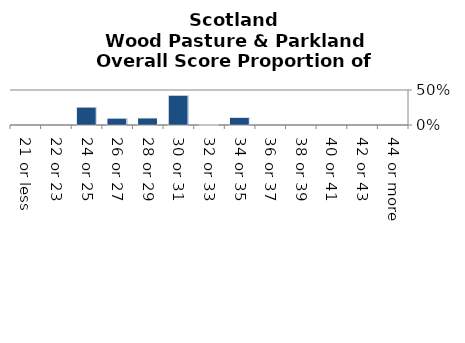
| Category | Wood Pasture & Parkland |
|---|---|
| 21 or less | 0 |
| 22 or 23 | 0 |
| 24 or 25 | 0.257 |
| 26 or 27 | 0.098 |
| 28 or 29 | 0.101 |
| 30 or 31 | 0.426 |
| 32 or 33 | 0.007 |
| 34 or 35 | 0.11 |
| 36 or 37 | 0 |
| 38 or 39 | 0 |
| 40 or 41 | 0 |
| 42 or 43 | 0 |
| 44 or more | 0 |